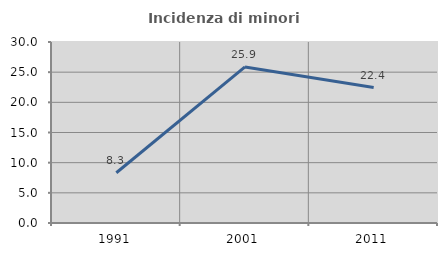
| Category | Incidenza di minori stranieri |
|---|---|
| 1991.0 | 8.333 |
| 2001.0 | 25.862 |
| 2011.0 | 22.445 |